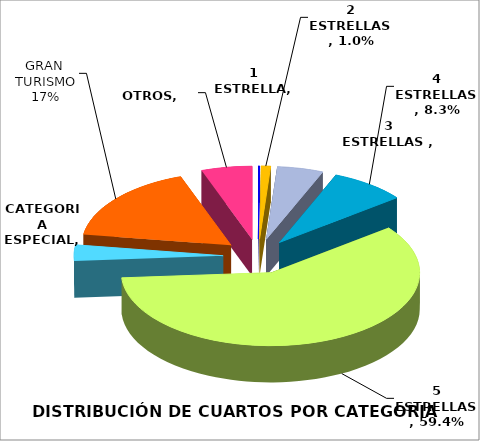
| Category | CATEGORIA  |
|---|---|
| 1 ESTRELLA | 0.002 |
| 2 ESTRELLAS | 0.01 |
| 3 ESTRELLAS  | 0.05 |
| 4 ESTRELLAS | 0.083 |
| 5 ESTRELLAS | 0.594 |
| CATEGORIA ESPECIAL | 0.035 |
| GRAN TURISMO | 0.171 |
| OTROS | 0.055 |